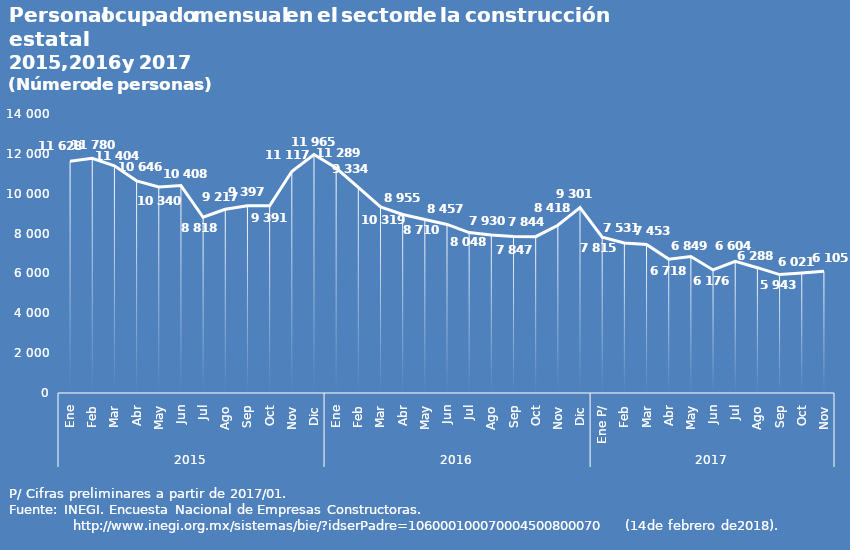
| Category | Series 0 |
|---|---|
| 0 | 11628 |
| 1 | 11780 |
| 2 | 11404 |
| 3 | 10646 |
| 4 | 10340 |
| 5 | 10408 |
| 6 | 8818 |
| 7 | 9217 |
| 8 | 9397 |
| 9 | 9391 |
| 10 | 11117 |
| 11 | 11965 |
| 12 | 11289 |
| 13 | 10319 |
| 14 | 9334 |
| 15 | 8955 |
| 16 | 8710 |
| 17 | 8457 |
| 18 | 8048 |
| 19 | 7930 |
| 20 | 7847 |
| 21 | 7844 |
| 22 | 8418 |
| 23 | 9301 |
| 24 | 7815 |
| 25 | 7531 |
| 26 | 7453 |
| 27 | 6718 |
| 28 | 6849 |
| 29 | 6176 |
| 30 | 6604 |
| 31 | 6288 |
| 32 | 5943 |
| 33 | 6021 |
| 34 | 6105 |